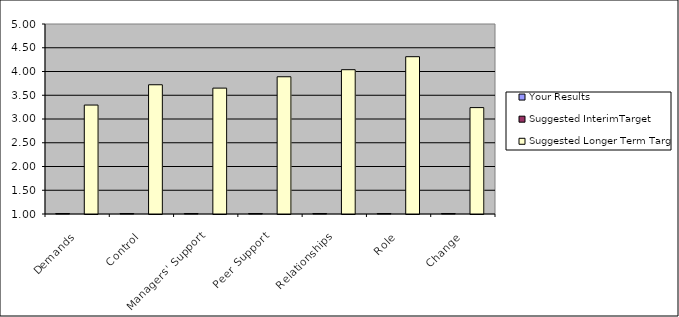
| Category | Your Results | Suggested InterimTarget | Suggested Longer Term Target |
|---|---|---|---|
| Demands | 0 |  | 3.294 |
| Control | 0 |  | 3.721 |
| Managers' Support | 0 |  | 3.65 |
| Peer Support | 0 |  | 3.889 |
| Relationships | 0 |  | 4.038 |
| Role | 0 |  | 4.312 |
| Change | 0 |  | 3.24 |